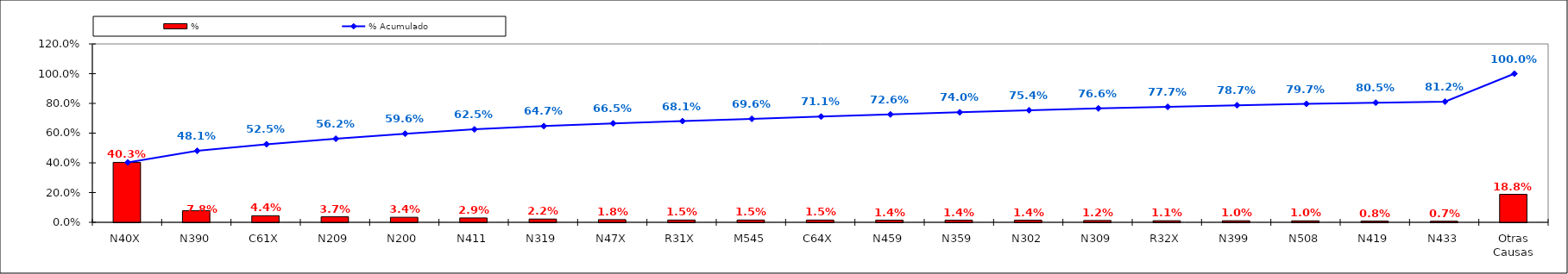
| Category | % |
|---|---|
| N40X | 0.403 |
| N390 | 0.078 |
| C61X | 0.044 |
| N209 | 0.037 |
| N200 | 0.034 |
| N411 | 0.029 |
| N319 | 0.022 |
| N47X | 0.018 |
| R31X | 0.015 |
| M545 | 0.015 |
| C64X | 0.015 |
| N459 | 0.014 |
| N359 | 0.014 |
| N302 | 0.014 |
| N309 | 0.012 |
| R32X | 0.011 |
| N399 | 0.01 |
| N508 | 0.01 |
| N419 | 0.008 |
| N433 | 0.007 |
| Otras Causas | 0.188 |